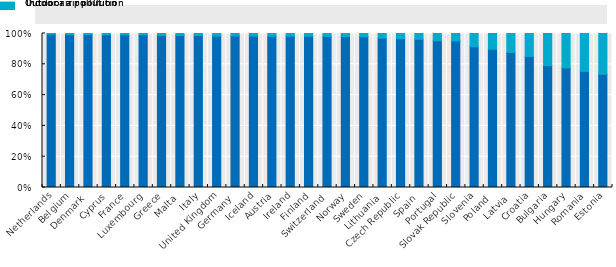
| Category | Outdoor air pollution | Indoor air pollution |
|---|---|---|
| Netherlands | 5943.02 | 30.819 |
| Belgium | 4418.728 | 27.478 |
| Denmark | 2049.153 | 12.749 |
| Cyprus | 449.27 | 3.653 |
| France | 17101.46 | 145.11 |
| Luxembourg | 144.593 | 1.351 |
| Greece | 6201.158 | 78.069 |
| Malta | 200.73 | 2.569 |
| Italy | 25895.676 | 347.418 |
| United Kingdom | 22294.087 | 348.126 |
| Germany | 36953.441 | 599.188 |
| Iceland | 48.627 | 0.81 |
| Austria | 3069.658 | 53.587 |
| Ireland | 999.084 | 17.476 |
| Finland | 1008.44 | 17.737 |
| Switzerland | 1973.951 | 37.583 |
| Norway | 967.339 | 19.61 |
| Sweden | 1917.784 | 42.469 |
| Lithuania | 1940.434 | 60.423 |
| Czech Republic | 5878.387 | 205.86 |
| Spain | 13418.318 | 521.804 |
| Portugal | 3536.904 | 175.107 |
| Slovak Republic | 2887.824 | 144.294 |
| Slovenia | 775.107 | 73.189 |
| Poland | 21176.015 | 2399.675 |
| Latvia | 1259.082 | 177.176 |
| Croatia | 2458.627 | 429.835 |
| Bulgaria | 5856.921 | 1541.406 |
| Hungary | 5588.208 | 1607.055 |
| Romania | 11014.727 | 3589.937 |
| Estonia | 319.994 | 115.264 |